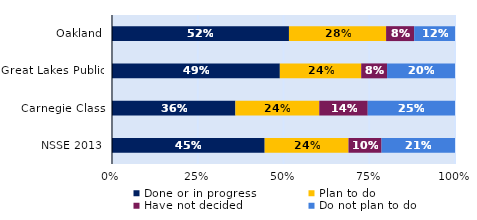
| Category | Done or in progress | Plan to do | Have not decided | Do not plan to do |
|---|---|---|---|---|
| Oakland | 0.516 | 0.283 | 0.082 | 0.119 |
| Great Lakes Public | 0.489 | 0.237 | 0.075 | 0.198 |
| Carnegie Class | 0.36 | 0.245 | 0.141 | 0.254 |
| NSSE 2013 | 0.445 | 0.244 | 0.096 | 0.214 |